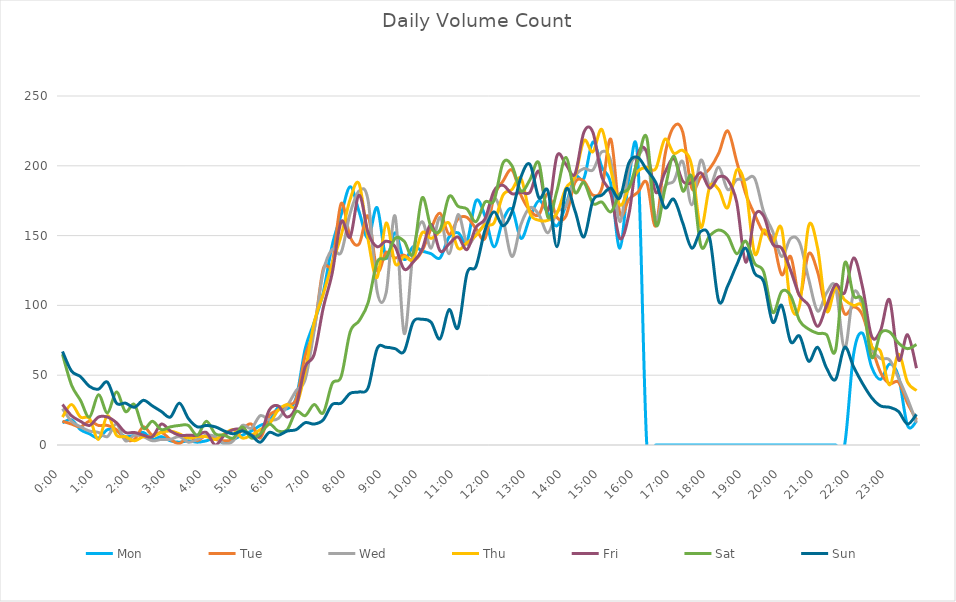
| Category | Mon | Tue | Wed | Thu | Fri | Sat | Sun |
|---|---|---|---|---|---|---|---|
| 0.0 | 16 | 17 | 26 | 20 | 29 | 65 | 67 |
| 0.010416666666666666 | 18 | 15 | 17 | 29 | 21 | 43 | 53 |
| 0.020833333333333332 | 11 | 13 | 13 | 20 | 17 | 32 | 49 |
| 0.03125 | 8 | 17 | 10 | 19 | 14 | 20 | 42 |
| 0.041666666666666664 | 5 | 14 | 9 | 4 | 20 | 36 | 40 |
| 0.05208333333333333 | 11 | 14 | 6 | 21 | 20 | 23 | 45 |
| 0.06249999999999999 | 10 | 11 | 15 | 7 | 16 | 38 | 30 |
| 0.07291666666666666 | 6 | 4 | 3 | 6 | 9 | 24 | 30 |
| 0.08333333333333333 | 7 | 4 | 7 | 3 | 9 | 29 | 27 |
| 0.09375 | 9 | 13 | 6 | 6 | 7 | 12 | 32 |
| 0.10416666666666667 | 4 | 7 | 3 | 6 | 6 | 17 | 28 |
| 0.11458333333333334 | 6 | 9 | 4 | 9 | 15 | 11 | 24 |
| 0.125 | 3 | 4 | 4 | 10 | 10 | 13 | 20 |
| 0.13541666666666666 | 2 | 1 | 6 | 8 | 7 | 14 | 30 |
| 0.14583333333333331 | 3 | 6 | 2 | 5 | 7 | 14 | 19 |
| 0.15624999999999997 | 2 | 3 | 4 | 6 | 7 | 7 | 13 |
| 0.16666666666666663 | 3 | 7 | 7 | 6 | 9 | 17 | 14 |
| 0.1770833333333333 | 5 | 4 | 6 | 4 | 0 | 8 | 13 |
| 0.18749999999999994 | 1 | 3 | 1 | 8 | 7 | 7 | 10 |
| 0.1979166666666666 | 4 | 4 | 3 | 11 | 11 | 5 | 8 |
| 0.20833333333333326 | 7 | 11 | 14 | 5 | 11 | 13 | 10 |
| 0.21874999999999992 | 10 | 15 | 12 | 7 | 7 | 5 | 7 |
| 0.22916666666666657 | 14 | 5 | 21 | 11 | 7 | 8 | 2 |
| 0.23958333333333323 | 17 | 21 | 18 | 15 | 25 | 15 | 9 |
| 0.2499999999999999 | 27 | 25 | 19 | 25 | 28 | 10 | 7 |
| 0.2604166666666666 | 26 | 29 | 28 | 29 | 20 | 11 | 10 |
| 0.27083333333333326 | 34 | 33 | 39 | 28 | 28 | 24 | 11 |
| 0.28124999999999994 | 69 | 64 | 47 | 53 | 56 | 21 | 16 |
| 0.29166666666666663 | 88 | 83 | 82 | 88 | 65 | 29 | 15 |
| 0.3020833333333333 | 109 | 126 | 124 | 108 | 98 | 23 | 18 |
| 0.3125 | 143 | 130 | 140 | 130 | 123 | 44 | 29 |
| 0.3229166666666667 | 165 | 173 | 138 | 150 | 160 | 49 | 30 |
| 0.33333333333333337 | 185 | 149 | 166 | 176 | 149 | 81 | 37 |
| 0.34375000000000006 | 167 | 144 | 182 | 187 | 179 | 89 | 38 |
| 0.35416666666666674 | 148 | 164 | 175 | 147 | 152 | 102 | 41 |
| 0.3645833333333334 | 170 | 125 | 110 | 120 | 142 | 131 | 69 |
| 0.3750000000000001 | 134 | 138 | 109 | 159 | 146 | 134 | 70 |
| 0.3854166666666668 | 152 | 134 | 164 | 130 | 142 | 148 | 69 |
| 0.3958333333333335 | 133 | 136 | 80 | 135 | 126 | 146 | 67 |
| 0.40625000000000017 | 142 | 132 | 138 | 133 | 131 | 137 | 88 |
| 0.41666666666666685 | 139 | 139 | 160 | 152 | 140 | 177 | 90 |
| 0.4270833333333333 | 137 | 155 | 141 | 148 | 158 | 156 | 88 |
| 0.4375000000000002 | 134 | 166 | 163 | 153 | 139 | 154 | 76 |
| 0.4479166666666669 | 149 | 151 | 137 | 159 | 144 | 178 | 97 |
| 0.4583333333333333 | 152 | 162 | 165 | 141 | 149 | 171 | 84 |
| 0.4687500000000003 | 146 | 163 | 144 | 145 | 140 | 169 | 123 |
| 0.47916666666666696 | 175 | 155 | 151 | 150 | 156 | 160 | 128 |
| 0.4895833333333333 | 164 | 148 | 159 | 158 | 162 | 174 | 154 |
| 0.5000000000000003 | 142 | 178 | 177 | 159 | 182 | 175 | 167 |
| 0.510416666666667 | 161 | 189 | 162 | 179 | 186 | 202 | 157 |
| 0.5208333333333334 | 169 | 197 | 135 | 183 | 180 | 200 | 167 |
| 0.5312500000000002 | 148 | 179 | 158 | 191 | 181 | 182 | 192 |
| 0.5416666666666669 | 163 | 168 | 170 | 166 | 181 | 190 | 201 |
| 0.5520833333333335 | 175 | 165 | 165 | 161 | 196 | 202 | 177 |
| 0.5625000000000001 | 166 | 180 | 152 | 161 | 168 | 163 | 182 |
| 0.5729166666666667 | 157 | 163 | 167 | 166 | 207 | 182 | 142 |
| 0.5833333333333334 | 172 | 164 | 171 | 184 | 201 | 206 | 183 |
| 0.59375 | 192 | 188 | 192 | 192 | 194 | 181 | 168 |
| 0.6041666666666666 | 191 | 189 | 198 | 218 | 224 | 188 | 149 |
| 0.6145833333333333 | 217 | 179 | 197 | 210 | 224 | 173 | 175 |
| 0.6249999999999999 | 199 | 184 | 210 | 226 | 192 | 174 | 179 |
| 0.6354166666666665 | 187 | 219 | 203 | 197 | 180 | 167 | 184 |
| 0.6458333333333331 | 141 | 166 | 160 | 172 | 148 | 180 | 177 |
| 0.6562499999999998 | 191 | 176 | 198 | 184 | 165 | 184 | 202 |
| 0.6666666666666666 | 204 | 181 | 207 | 196 | 208 | 204 | 206 |
| 0.677083333333333 | 0 | 188 | 209 | 199 | 210 | 220 | 197 |
| 0.6874999999999997 | 0 | 157 | 162 | 198 | 181 | 158 | 188 |
| 0.6979166666666666 | 0 | 207 | 185 | 219 | 195 | 183 | 170 |
| 0.7083333333333329 | 0 | 228 | 189 | 209 | 205 | 207 | 176 |
| 0.7187499999999996 | 0 | 224 | 203 | 211 | 189 | 182 | 159 |
| 0.7291666666666666 | 0 | 184 | 172 | 200 | 188 | 192 | 141 |
| 0.7395833333333328 | 0 | 192 | 204 | 156 | 195 | 143 | 153 |
| 0.75 | 0 | 198 | 186 | 185 | 184 | 150 | 148 |
| 0.7604166666666666 | 0 | 209 | 199 | 183 | 192 | 154 | 103 |
| 0.7708333333333327 | 0 | 225 | 183 | 170 | 190 | 150 | 114 |
| 0.78125 | 0 | 203 | 190 | 197 | 174 | 137 | 129 |
| 0.7916666666666666 | 0 | 180 | 190 | 184 | 131 | 146 | 141 |
| 0.8020833333333326 | 0 | 165 | 191 | 137 | 164 | 130 | 123 |
| 0.8125 | 0 | 152 | 167 | 154 | 164 | 124 | 117 |
| 0.8229166666666666 | 0 | 148 | 153 | 145 | 144 | 95 | 88 |
| 0.8333333333333334 | 0 | 122 | 135 | 155 | 141 | 110 | 100 |
| 0.84375 | 0 | 135 | 148 | 101 | 125 | 107 | 74 |
| 0.8541666666666666 | 0 | 107 | 145 | 100 | 107 | 89 | 78 |
| 0.8645833333333334 | 0 | 137 | 119 | 157 | 100 | 83 | 60 |
| 0.875 | 0 | 124 | 96 | 141 | 85 | 80 | 70 |
| 0.8854166666666666 | 0 | 98 | 109 | 96 | 100 | 79 | 55 |
| 0.8958333333333334 | 0 | 113 | 113 | 113 | 115 | 68 | 47 |
| 0.90625 | 0 | 94 | 69 | 104 | 109 | 130 | 70 |
| 0.9166666666666666 | 65 | 99 | 109 | 100 | 134 | 107 | 56 |
| 0.9270833333333334 | 80 | 93 | 99 | 99 | 113 | 103 | 44 |
| 0.9375 | 56 | 71 | 70 | 71 | 78 | 63 | 34 |
| 0.9479166666666666 | 47 | 52 | 62 | 67 | 82 | 80 | 28 |
| 0.9583333333333334 | 58 | 44 | 61 | 43 | 104 | 81 | 27 |
| 0.96875 | 49 | 45 | 48 | 65 | 61 | 73 | 24 |
| 0.9791666666666666 | 14 | 30 | 33 | 45 | 79 | 69 | 15 |
| 0.9895833333333334 | 17 | 18 | 16 | 39 | 55 | 72 | 22 |